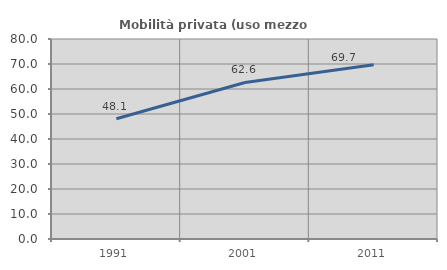
| Category | Mobilità privata (uso mezzo privato) |
|---|---|
| 1991.0 | 48.119 |
| 2001.0 | 62.614 |
| 2011.0 | 69.679 |